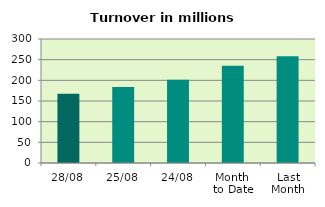
| Category | Series 0 |
|---|---|
| 28/08 | 167.252 |
| 25/08 | 183.823 |
| 24/08 | 201.24 |
| Month 
to Date | 235.141 |
| Last
Month | 258.125 |